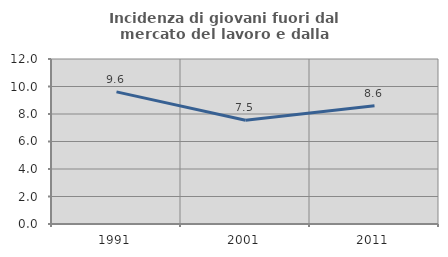
| Category | Incidenza di giovani fuori dal mercato del lavoro e dalla formazione  |
|---|---|
| 1991.0 | 9.607 |
| 2001.0 | 7.547 |
| 2011.0 | 8.594 |